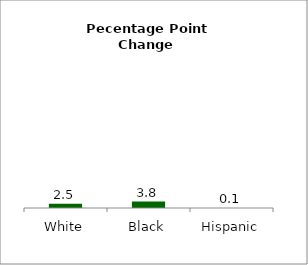
| Category | Series 0 |
|---|---|
| White | 2.542 |
| Black | 3.773 |
| Hispanic | 0.06 |